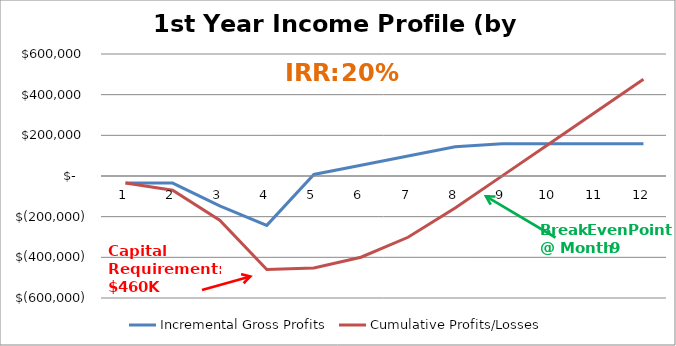
| Category | Incremental Gross Profits | Cumulative Profits/Losses |
|---|---|---|
| 0 | -34826.433 | -34826.433 |
| 1 | -34826.433 | -69652.867 |
| 2 | -147326.433 | -216979.3 |
| 3 | -242766.433 | -459745.733 |
| 4 | 7424.367 | -452321.367 |
| 5 | 52820.367 | -399501 |
| 6 | 98216.367 | -301284.633 |
| 7 | 143612.367 | -157672.267 |
| 8 | 158276.367 | 604.1 |
| 9 | 158276.367 | 158880.467 |
| 10 | 158276.367 | 317156.833 |
| 11 | 158276.367 | 475433.2 |